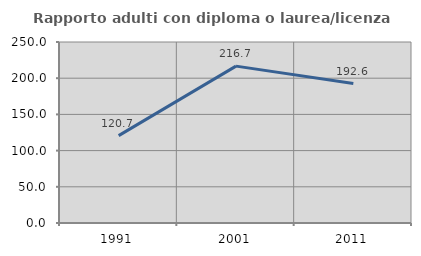
| Category | Rapporto adulti con diploma o laurea/licenza media  |
|---|---|
| 1991.0 | 120.732 |
| 2001.0 | 216.667 |
| 2011.0 | 192.632 |